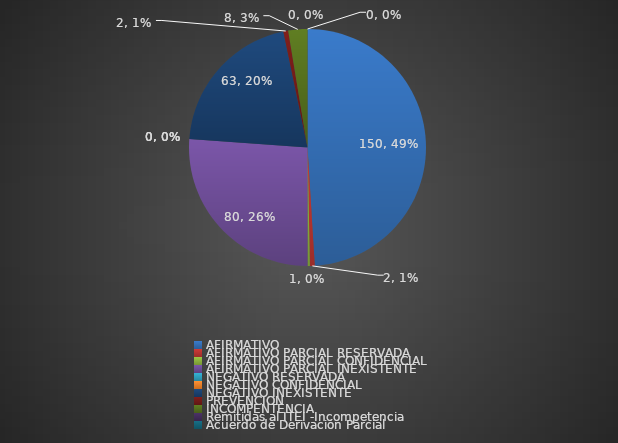
| Category | Series 0 |
|---|---|
| AFIRMATIVO | 150 |
| AFIRMATIVO PARCIAL RESERVADA | 2 |
| AFIRMATIVO PARCIAL CONFIDENCIAL | 1 |
| AFIRMATIVO PARCIAL INEXISTENTE | 80 |
| NEGATIVO RESERVADA | 0 |
| NEGATIVO CONFIDENCIAL | 0 |
| NEGATIVO INEXISTENTE | 63 |
| PREVENCION | 2 |
| INCOMPENTENCIA | 8 |
| Remitidas al ITEI -Incompetencia  | 0 |
| Acuerdo de Derivación Parcial | 0 |